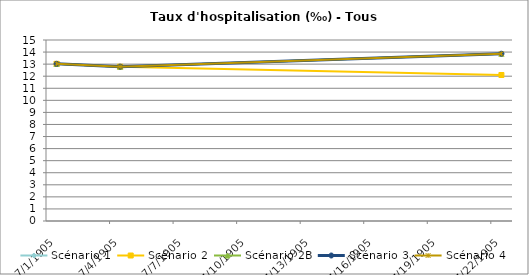
| Category | Scénario 1 | Scénario 2 | Scénario 2B | Scénario 3 | Scénario 4 |
|---|---|---|---|---|---|
| 2009.0 | 13.025 | 13.025 | 13.025 | 13.025 | 13.025 |
| 2012.0 | 12.789 | 12.789 | 12.789 | 12.789 | 12.789 |
| 2030.0 | 13.863 | 12.098 | 13.863 | 13.863 | 13.863 |